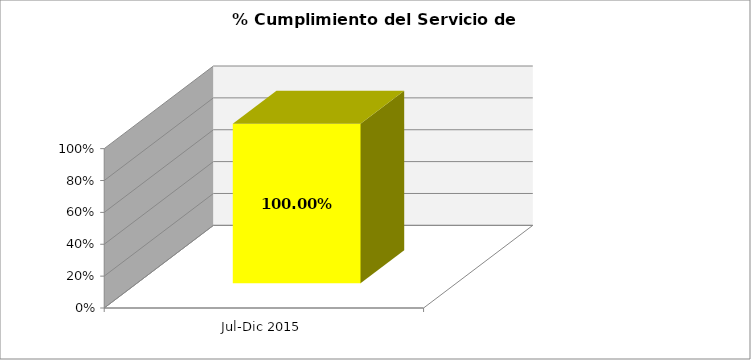
| Category | % |
|---|---|
| Jul-Dic 2015 | 1 |